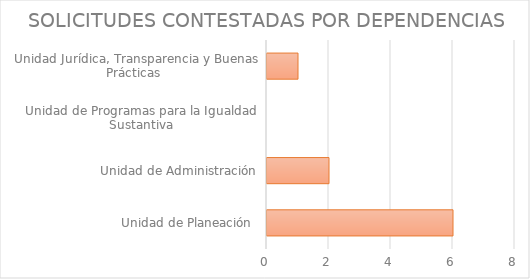
| Category | Series 1 |
|---|---|
| Unidad de Planeación  | 6 |
| Unidad de Administración | 2 |
| Unidad de Programas para la Igualdad Sustantiva | 0 |
| Unidad Jurídica, Transparencia y Buenas Prácticas  | 1 |